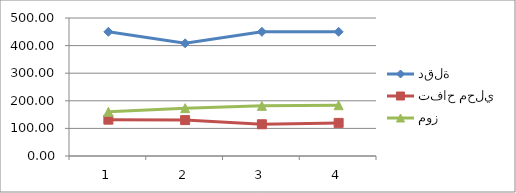
| Category | دقلة | تفاح محلي | موز |
|---|---|---|---|
| 0 | 450 | 131.667 | 160 |
| 1 | 408.333 | 130 | 173.333 |
| 2 | 450 | 115 | 181.667 |
| 3 | 450 | 120 | 184 |